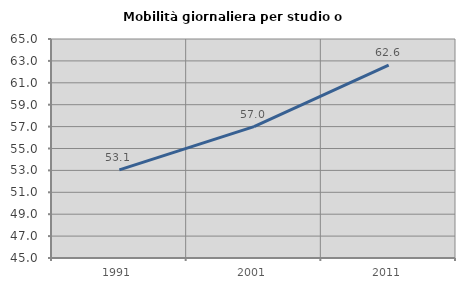
| Category | Mobilità giornaliera per studio o lavoro |
|---|---|
| 1991.0 | 53.053 |
| 2001.0 | 57.002 |
| 2011.0 | 62.608 |